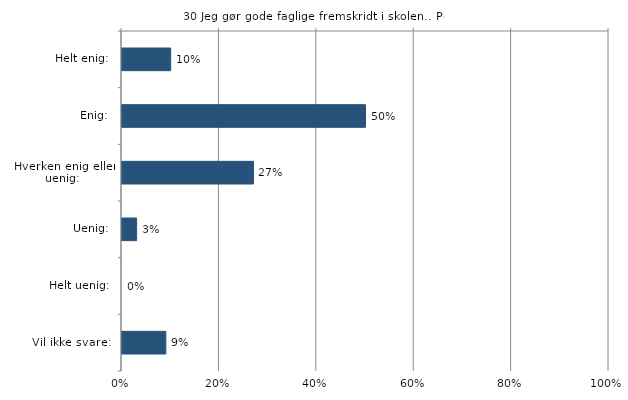
| Category | Jeg gør gode faglige fremskridt i skolen. |
|---|---|
| Helt enig:  | 0.1 |
| Enig:  | 0.5 |
| Hverken enig eller uenig:  | 0.27 |
| Uenig:  | 0.03 |
| Helt uenig:  | 0 |
| Vil ikke svare:  | 0.09 |